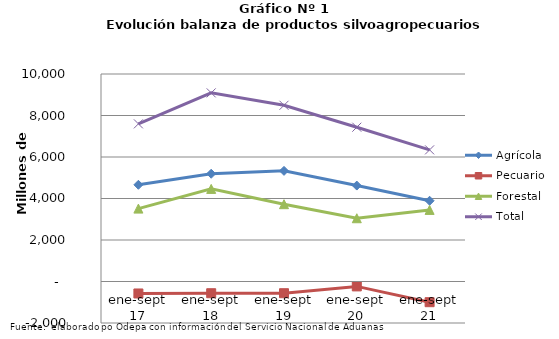
| Category | Agrícola | Pecuario | Forestal | Total |
|---|---|---|---|---|
| ene-sept 17 | 4661104 | -577501 | 3513486 | 7597089 |
| ene-sept 18 | 5193102 | -565487 | 4462457 | 9090072 |
| ene-sept 19 | 5331731 | -564116 | 3725321 | 8492936 |
| ene-sept 20 | 4623093 | -236387 | 3048820 | 7435526 |
| ene-sept 21 | 3891119 | -997638 | 3450275 | 6343756 |